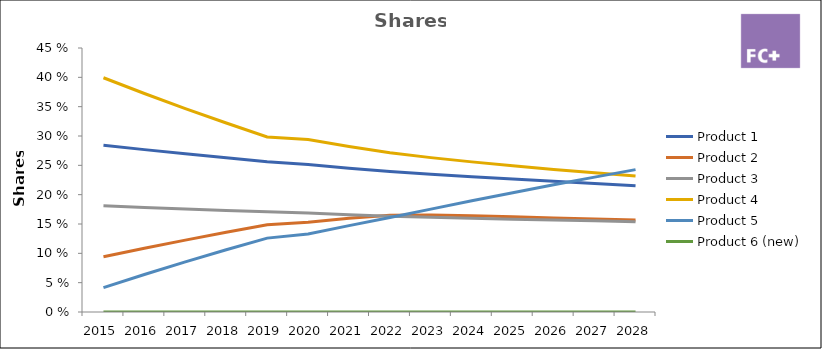
| Category | Product 1 | Product 2 | Product 3 | Product 4 | Product 5 | Product 6 (new) |
|---|---|---|---|---|---|---|
| 2015.0 | 0.284 | 0.094 | 0.181 | 0.399 | 0.041 | 0 |
| 2016.0 | 0.277 | 0.109 | 0.178 | 0.372 | 0.064 | 0 |
| 2017.0 | 0.27 | 0.122 | 0.176 | 0.347 | 0.085 | 0 |
| 2018.0 | 0.263 | 0.136 | 0.173 | 0.322 | 0.106 | 0 |
| 2019.0 | 0.256 | 0.149 | 0.171 | 0.298 | 0.126 | 0 |
| 2020.0 | 0.251 | 0.153 | 0.169 | 0.294 | 0.133 | 0 |
| 2021.0 | 0.245 | 0.16 | 0.166 | 0.282 | 0.147 | 0 |
| 2022.0 | 0.239 | 0.165 | 0.163 | 0.272 | 0.161 | 0 |
| 2023.0 | 0.235 | 0.165 | 0.161 | 0.263 | 0.175 | 0 |
| 2024.0 | 0.231 | 0.164 | 0.16 | 0.256 | 0.19 | 0 |
| 2025.0 | 0.227 | 0.162 | 0.158 | 0.249 | 0.203 | 0 |
| 2026.0 | 0.223 | 0.16 | 0.157 | 0.243 | 0.217 | 0 |
| 2027.0 | 0.219 | 0.158 | 0.155 | 0.237 | 0.23 | 0 |
| 2028.0 | 0.215 | 0.157 | 0.154 | 0.232 | 0.243 | 0 |